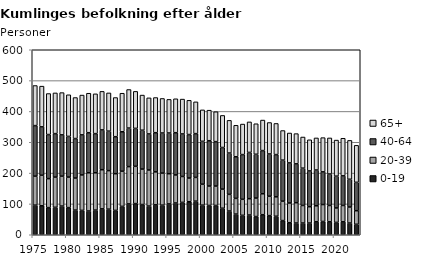
| Category | 0-19 | 20-39 | 40-64 | 65+ |
|---|---|---|---|---|
| 1975.0 | 96 | 94 | 164 | 130 |
| 1976.0 | 94 | 99 | 157 | 132 |
| 1977.0 | 88 | 94 | 143 | 133 |
| 1978.0 | 89 | 98 | 141 | 132 |
| 1979.0 | 93 | 97 | 134 | 137 |
| 1980.0 | 88 | 99 | 132 | 135 |
| 1981.0 | 80 | 104 | 128 | 133 |
| 1982.0 | 79 | 115 | 130 | 129 |
| 1983.0 | 77 | 124 | 130 | 128 |
| 1984.0 | 80 | 121 | 127 | 129 |
| 1985.0 | 84 | 127 | 129 | 125 |
| 1986.0 | 83 | 125 | 128 | 124 |
| 1987.0 | 79 | 119 | 120 | 127 |
| 1988.0 | 92 | 114 | 128 | 125 |
| 1989.0 | 100 | 121 | 125 | 125 |
| 1990.0 | 101 | 121 | 123 | 120 |
| 1991.0 | 98 | 115 | 126 | 114 |
| 1992.0 | 93 | 117 | 117 | 117 |
| 1993.0 | 97 | 107 | 127 | 114 |
| 1994.0 | 96 | 104 | 130 | 112 |
| 1995.0 | 100 | 98 | 132 | 109 |
| 1996.0 | 103 | 91 | 137 | 110 |
| 1997.0 | 105 | 84 | 138 | 113 |
| 1998.0 | 107 | 77 | 141 | 111 |
| 1999.0 | 109 | 77 | 142 | 103 |
| 2000.0 | 96 | 68 | 139 | 102 |
| 2001.0 | 95 | 63 | 147 | 99 |
| 2002.0 | 95 | 63 | 144 | 97 |
| 2003.0 | 86 | 62 | 135 | 104 |
| 2004.0 | 77 | 54 | 134 | 106 |
| 2005.0 | 67 | 51 | 135 | 102 |
| 2006.0 | 63 | 52 | 145 | 99 |
| 2007.0 | 64 | 53 | 150 | 99 |
| 2008.0 | 59 | 60 | 142 | 99 |
| 2009.0 | 65 | 68 | 140 | 99 |
| 2010.0 | 62 | 63 | 137 | 102 |
| 2011.0 | 60 | 63 | 137 | 101 |
| 2012.0 | 46 | 63 | 133 | 96 |
| 2013.0 | 39 | 64 | 130 | 97 |
| 2014.0 | 38 | 66 | 126 | 98 |
| 2015.0 | 38 | 57 | 121 | 101 |
| 2016.0 | 38 | 53 | 116 | 101 |
| 2017.0 | 42 | 52 | 116 | 104 |
| 2018.0 | 43 | 55 | 106 | 111 |
| 2019.0 | 42 | 53 | 102 | 117 |
| 2020.0 | 40 | 47 | 103 | 117 |
| 2021.0 | 42 | 53 | 96 | 122 |
| 2022.0 | 38 | 52 | 90 | 126 |
| 2023.0 | 34 | 44 | 92 | 120 |